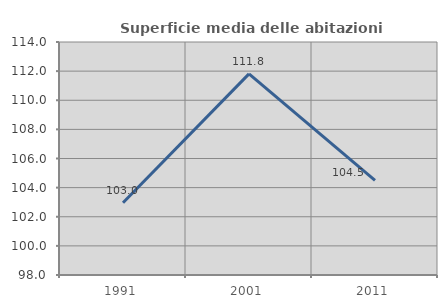
| Category | Superficie media delle abitazioni occupate |
|---|---|
| 1991.0 | 102.959 |
| 2001.0 | 111.811 |
| 2011.0 | 104.502 |